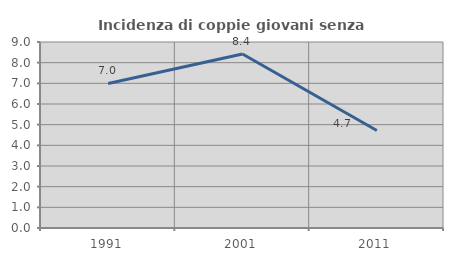
| Category | Incidenza di coppie giovani senza figli |
|---|---|
| 1991.0 | 6.994 |
| 2001.0 | 8.418 |
| 2011.0 | 4.716 |